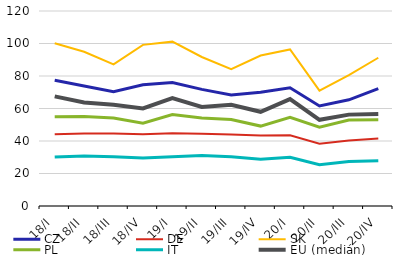
| Category | CZ | DE | SK | PL | IT | EU (medián) |
|---|---|---|---|---|---|---|
| 18/I | 77.421 | 44.174 | 100.175 | 54.991 | 30.092 | 67.472 |
| 18/II | 73.871 | 44.615 | 94.924 | 55.133 | 30.779 | 63.757 |
| 18/III | 70.401 | 44.629 | 87.178 | 54.143 | 30.275 | 62.274 |
| 18/IV | 74.553 | 44.094 | 99.157 | 51.011 | 29.54 | 60.08 |
| 19/I | 76.041 | 44.771 | 101.148 | 56.275 | 30.264 | 66.345 |
| 19/II | 71.758 | 44.425 | 91.704 | 54.159 | 31.043 | 60.993 |
| 19/III | 68.321 | 43.952 | 84.261 | 53.278 | 30.31 | 62.252 |
| 19/IV | 69.961 | 43.352 | 92.6 | 49.177 | 28.757 | 57.963 |
| 20/I | 72.715 | 43.48 | 96.327 | 54.55 | 29.927 | 65.809 |
| 20/II | 61.55 | 38.263 | 70.98 | 48.474 | 25.343 | 53.023 |
| 20/III | 65.338 | 40.284 | 80.584 | 52.886 | 27.325 | 56.233 |
| 20/IV | 72.187 | 41.578 | 91.234 | 53.022 | 27.798 | 56.672 |